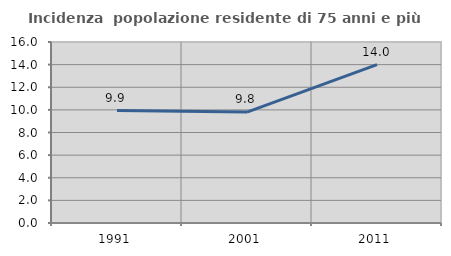
| Category | Incidenza  popolazione residente di 75 anni e più |
|---|---|
| 1991.0 | 9.938 |
| 2001.0 | 9.808 |
| 2011.0 | 14.002 |